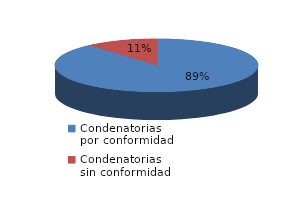
| Category | Series 0 |
|---|---|
| 0 | 249 |
| 1 | 32 |